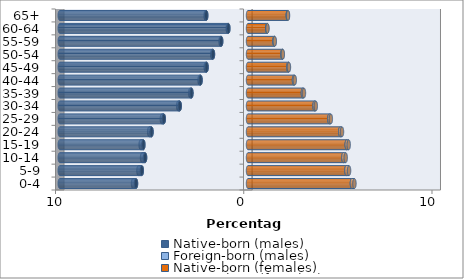
| Category | Native-born (males) | Foreign-born (males) | Native-born (females) | Foreign-born (females) |
|---|---|---|---|---|
| 0-4 | -5.949 | -0.16 | 5.519 | 0.135 |
| 5-9 | -5.641 | -0.179 | 5.226 | 0.143 |
| 10-14 | -5.467 | -0.161 | 5.063 | 0.127 |
| 15-19 | -5.558 | -0.145 | 5.243 | 0.107 |
| 20-24 | -5.124 | -0.127 | 4.898 | 0.096 |
| 25-29 | -4.472 | -0.104 | 4.318 | 0.083 |
| 30-34 | -3.626 | -0.084 | 3.532 | 0.071 |
| 35-39 | -3.004 | -0.067 | 2.915 | 0.058 |
| 40-44 | -2.519 | -0.055 | 2.441 | 0.045 |
| 45-49 | -2.2 | -0.046 | 2.14 | 0.034 |
| 50-54 | -1.861 | -0.04 | 1.824 | 0.026 |
| 55-59 | -1.424 | -0.035 | 1.402 | 0.019 |
| 60-64 | -1.043 | -0.032 | 1.018 | 0.015 |
| 65+ | -2.218 | -0.032 | 2.113 | 0.013 |